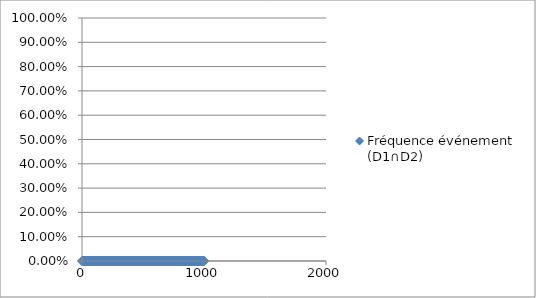
| Category | Fréquence événement (D1∩D2) |
|---|---|
| 1.0 | 0 |
| 2.0 | 0 |
| 3.0 | 0 |
| 4.0 | 0 |
| 5.0 | 0 |
| 6.0 | 0 |
| 7.0 | 0 |
| 8.0 | 0 |
| 9.0 | 0 |
| 10.0 | 0 |
| 11.0 | 0 |
| 12.0 | 0 |
| 13.0 | 0 |
| 14.0 | 0 |
| 15.0 | 0 |
| 16.0 | 0 |
| 17.0 | 0 |
| 18.0 | 0 |
| 19.0 | 0 |
| 20.0 | 0 |
| 21.0 | 0 |
| 22.0 | 0 |
| 23.0 | 0 |
| 24.0 | 0 |
| 25.0 | 0 |
| 26.0 | 0 |
| 27.0 | 0 |
| 28.0 | 0 |
| 29.0 | 0 |
| 30.0 | 0 |
| 31.0 | 0 |
| 32.0 | 0 |
| 33.0 | 0 |
| 34.0 | 0 |
| 35.0 | 0 |
| 36.0 | 0 |
| 37.0 | 0 |
| 38.0 | 0 |
| 39.0 | 0 |
| 40.0 | 0 |
| 41.0 | 0 |
| 42.0 | 0 |
| 43.0 | 0 |
| 44.0 | 0 |
| 45.0 | 0 |
| 46.0 | 0 |
| 47.0 | 0 |
| 48.0 | 0 |
| 49.0 | 0 |
| 50.0 | 0 |
| 51.0 | 0 |
| 52.0 | 0 |
| 53.0 | 0 |
| 54.0 | 0 |
| 55.0 | 0 |
| 56.0 | 0 |
| 57.0 | 0 |
| 58.0 | 0 |
| 59.0 | 0 |
| 60.0 | 0 |
| 61.0 | 0 |
| 62.0 | 0 |
| 63.0 | 0 |
| 64.0 | 0 |
| 65.0 | 0 |
| 66.0 | 0 |
| 67.0 | 0 |
| 68.0 | 0 |
| 69.0 | 0 |
| 70.0 | 0 |
| 71.0 | 0 |
| 72.0 | 0 |
| 73.0 | 0 |
| 74.0 | 0 |
| 75.0 | 0 |
| 76.0 | 0 |
| 77.0 | 0 |
| 78.0 | 0 |
| 79.0 | 0 |
| 80.0 | 0 |
| 81.0 | 0 |
| 82.0 | 0 |
| 83.0 | 0 |
| 84.0 | 0 |
| 85.0 | 0 |
| 86.0 | 0 |
| 87.0 | 0 |
| 88.0 | 0 |
| 89.0 | 0 |
| 90.0 | 0 |
| 91.0 | 0 |
| 92.0 | 0 |
| 93.0 | 0 |
| 94.0 | 0 |
| 95.0 | 0 |
| 96.0 | 0 |
| 97.0 | 0 |
| 98.0 | 0 |
| 99.0 | 0 |
| 100.0 | 0 |
| 101.0 | 0 |
| 102.0 | 0 |
| 103.0 | 0 |
| 104.0 | 0 |
| 105.0 | 0 |
| 106.0 | 0 |
| 107.0 | 0 |
| 108.0 | 0 |
| 109.0 | 0 |
| 110.0 | 0 |
| 111.0 | 0 |
| 112.0 | 0 |
| 113.0 | 0 |
| 114.0 | 0 |
| 115.0 | 0 |
| 116.0 | 0 |
| 117.0 | 0 |
| 118.0 | 0 |
| 119.0 | 0 |
| 120.0 | 0 |
| 121.0 | 0 |
| 122.0 | 0 |
| 123.0 | 0 |
| 124.0 | 0 |
| 125.0 | 0 |
| 126.0 | 0 |
| 127.0 | 0 |
| 128.0 | 0 |
| 129.0 | 0 |
| 130.0 | 0 |
| 131.0 | 0 |
| 132.0 | 0 |
| 133.0 | 0 |
| 134.0 | 0 |
| 135.0 | 0 |
| 136.0 | 0 |
| 137.0 | 0 |
| 138.0 | 0 |
| 139.0 | 0 |
| 140.0 | 0 |
| 141.0 | 0 |
| 142.0 | 0 |
| 143.0 | 0 |
| 144.0 | 0 |
| 145.0 | 0 |
| 146.0 | 0 |
| 147.0 | 0 |
| 148.0 | 0 |
| 149.0 | 0 |
| 150.0 | 0 |
| 151.0 | 0 |
| 152.0 | 0 |
| 153.0 | 0 |
| 154.0 | 0 |
| 155.0 | 0 |
| 156.0 | 0 |
| 157.0 | 0 |
| 158.0 | 0 |
| 159.0 | 0 |
| 160.0 | 0 |
| 161.0 | 0 |
| 162.0 | 0 |
| 163.0 | 0 |
| 164.0 | 0 |
| 165.0 | 0 |
| 166.0 | 0 |
| 167.0 | 0 |
| 168.0 | 0 |
| 169.0 | 0 |
| 170.0 | 0 |
| 171.0 | 0 |
| 172.0 | 0 |
| 173.0 | 0 |
| 174.0 | 0 |
| 175.0 | 0 |
| 176.0 | 0 |
| 177.0 | 0 |
| 178.0 | 0 |
| 179.0 | 0 |
| 180.0 | 0 |
| 181.0 | 0 |
| 182.0 | 0 |
| 183.0 | 0 |
| 184.0 | 0 |
| 185.0 | 0 |
| 186.0 | 0 |
| 187.0 | 0 |
| 188.0 | 0 |
| 189.0 | 0 |
| 190.0 | 0 |
| 191.0 | 0 |
| 192.0 | 0 |
| 193.0 | 0 |
| 194.0 | 0 |
| 195.0 | 0 |
| 196.0 | 0 |
| 197.0 | 0 |
| 198.0 | 0 |
| 199.0 | 0 |
| 200.0 | 0 |
| 201.0 | 0 |
| 202.0 | 0 |
| 203.0 | 0 |
| 204.0 | 0 |
| 205.0 | 0 |
| 206.0 | 0 |
| 207.0 | 0 |
| 208.0 | 0 |
| 209.0 | 0 |
| 210.0 | 0 |
| 211.0 | 0 |
| 212.0 | 0 |
| 213.0 | 0 |
| 214.0 | 0 |
| 215.0 | 0 |
| 216.0 | 0 |
| 217.0 | 0 |
| 218.0 | 0 |
| 219.0 | 0 |
| 220.0 | 0 |
| 221.0 | 0 |
| 222.0 | 0 |
| 223.0 | 0 |
| 224.0 | 0 |
| 225.0 | 0 |
| 226.0 | 0 |
| 227.0 | 0 |
| 228.0 | 0 |
| 229.0 | 0 |
| 230.0 | 0 |
| 231.0 | 0 |
| 232.0 | 0 |
| 233.0 | 0 |
| 234.0 | 0 |
| 235.0 | 0 |
| 236.0 | 0 |
| 237.0 | 0 |
| 238.0 | 0 |
| 239.0 | 0 |
| 240.0 | 0 |
| 241.0 | 0 |
| 242.0 | 0 |
| 243.0 | 0 |
| 244.0 | 0 |
| 245.0 | 0 |
| 246.0 | 0 |
| 247.0 | 0 |
| 248.0 | 0 |
| 249.0 | 0 |
| 250.0 | 0 |
| 251.0 | 0 |
| 252.0 | 0 |
| 253.0 | 0 |
| 254.0 | 0 |
| 255.0 | 0 |
| 256.0 | 0 |
| 257.0 | 0 |
| 258.0 | 0 |
| 259.0 | 0 |
| 260.0 | 0 |
| 261.0 | 0 |
| 262.0 | 0 |
| 263.0 | 0 |
| 264.0 | 0 |
| 265.0 | 0 |
| 266.0 | 0 |
| 267.0 | 0 |
| 268.0 | 0 |
| 269.0 | 0 |
| 270.0 | 0 |
| 271.0 | 0 |
| 272.0 | 0 |
| 273.0 | 0 |
| 274.0 | 0 |
| 275.0 | 0 |
| 276.0 | 0 |
| 277.0 | 0 |
| 278.0 | 0 |
| 279.0 | 0 |
| 280.0 | 0 |
| 281.0 | 0 |
| 282.0 | 0 |
| 283.0 | 0 |
| 284.0 | 0 |
| 285.0 | 0 |
| 286.0 | 0 |
| 287.0 | 0 |
| 288.0 | 0 |
| 289.0 | 0 |
| 290.0 | 0 |
| 291.0 | 0 |
| 292.0 | 0 |
| 293.0 | 0 |
| 294.0 | 0 |
| 295.0 | 0 |
| 296.0 | 0 |
| 297.0 | 0 |
| 298.0 | 0 |
| 299.0 | 0 |
| 300.0 | 0 |
| 301.0 | 0 |
| 302.0 | 0 |
| 303.0 | 0 |
| 304.0 | 0 |
| 305.0 | 0 |
| 306.0 | 0 |
| 307.0 | 0 |
| 308.0 | 0 |
| 309.0 | 0 |
| 310.0 | 0 |
| 311.0 | 0 |
| 312.0 | 0 |
| 313.0 | 0 |
| 314.0 | 0 |
| 315.0 | 0 |
| 316.0 | 0 |
| 317.0 | 0 |
| 318.0 | 0 |
| 319.0 | 0 |
| 320.0 | 0 |
| 321.0 | 0 |
| 322.0 | 0 |
| 323.0 | 0 |
| 324.0 | 0 |
| 325.0 | 0 |
| 326.0 | 0 |
| 327.0 | 0 |
| 328.0 | 0 |
| 329.0 | 0 |
| 330.0 | 0 |
| 331.0 | 0 |
| 332.0 | 0 |
| 333.0 | 0 |
| 334.0 | 0 |
| 335.0 | 0 |
| 336.0 | 0 |
| 337.0 | 0 |
| 338.0 | 0 |
| 339.0 | 0 |
| 340.0 | 0 |
| 341.0 | 0 |
| 342.0 | 0 |
| 343.0 | 0 |
| 344.0 | 0 |
| 345.0 | 0 |
| 346.0 | 0 |
| 347.0 | 0 |
| 348.0 | 0 |
| 349.0 | 0 |
| 350.0 | 0 |
| 351.0 | 0 |
| 352.0 | 0 |
| 353.0 | 0 |
| 354.0 | 0 |
| 355.0 | 0 |
| 356.0 | 0 |
| 357.0 | 0 |
| 358.0 | 0 |
| 359.0 | 0 |
| 360.0 | 0 |
| 361.0 | 0 |
| 362.0 | 0 |
| 363.0 | 0 |
| 364.0 | 0 |
| 365.0 | 0 |
| 366.0 | 0 |
| 367.0 | 0 |
| 368.0 | 0 |
| 369.0 | 0 |
| 370.0 | 0 |
| 371.0 | 0 |
| 372.0 | 0 |
| 373.0 | 0 |
| 374.0 | 0 |
| 375.0 | 0 |
| 376.0 | 0 |
| 377.0 | 0 |
| 378.0 | 0 |
| 379.0 | 0 |
| 380.0 | 0 |
| 381.0 | 0 |
| 382.0 | 0 |
| 383.0 | 0 |
| 384.0 | 0 |
| 385.0 | 0 |
| 386.0 | 0 |
| 387.0 | 0 |
| 388.0 | 0 |
| 389.0 | 0 |
| 390.0 | 0 |
| 391.0 | 0 |
| 392.0 | 0 |
| 393.0 | 0 |
| 394.0 | 0 |
| 395.0 | 0 |
| 396.0 | 0 |
| 397.0 | 0 |
| 398.0 | 0 |
| 399.0 | 0 |
| 400.0 | 0 |
| 401.0 | 0 |
| 402.0 | 0 |
| 403.0 | 0 |
| 404.0 | 0 |
| 405.0 | 0 |
| 406.0 | 0 |
| 407.0 | 0 |
| 408.0 | 0 |
| 409.0 | 0 |
| 410.0 | 0 |
| 411.0 | 0 |
| 412.0 | 0 |
| 413.0 | 0 |
| 414.0 | 0 |
| 415.0 | 0 |
| 416.0 | 0 |
| 417.0 | 0 |
| 418.0 | 0 |
| 419.0 | 0 |
| 420.0 | 0 |
| 421.0 | 0 |
| 422.0 | 0 |
| 423.0 | 0 |
| 424.0 | 0 |
| 425.0 | 0 |
| 426.0 | 0 |
| 427.0 | 0 |
| 428.0 | 0 |
| 429.0 | 0 |
| 430.0 | 0 |
| 431.0 | 0 |
| 432.0 | 0 |
| 433.0 | 0 |
| 434.0 | 0 |
| 435.0 | 0 |
| 436.0 | 0 |
| 437.0 | 0 |
| 438.0 | 0 |
| 439.0 | 0 |
| 440.0 | 0 |
| 441.0 | 0 |
| 442.0 | 0 |
| 443.0 | 0 |
| 444.0 | 0 |
| 445.0 | 0 |
| 446.0 | 0 |
| 447.0 | 0 |
| 448.0 | 0 |
| 449.0 | 0 |
| 450.0 | 0 |
| 451.0 | 0 |
| 452.0 | 0 |
| 453.0 | 0 |
| 454.0 | 0 |
| 455.0 | 0 |
| 456.0 | 0 |
| 457.0 | 0 |
| 458.0 | 0 |
| 459.0 | 0 |
| 460.0 | 0 |
| 461.0 | 0 |
| 462.0 | 0 |
| 463.0 | 0 |
| 464.0 | 0 |
| 465.0 | 0 |
| 466.0 | 0 |
| 467.0 | 0 |
| 468.0 | 0 |
| 469.0 | 0 |
| 470.0 | 0 |
| 471.0 | 0 |
| 472.0 | 0 |
| 473.0 | 0 |
| 474.0 | 0 |
| 475.0 | 0 |
| 476.0 | 0 |
| 477.0 | 0 |
| 478.0 | 0 |
| 479.0 | 0 |
| 480.0 | 0 |
| 481.0 | 0 |
| 482.0 | 0 |
| 483.0 | 0 |
| 484.0 | 0 |
| 485.0 | 0 |
| 486.0 | 0 |
| 487.0 | 0 |
| 488.0 | 0 |
| 489.0 | 0 |
| 490.0 | 0 |
| 491.0 | 0 |
| 492.0 | 0 |
| 493.0 | 0 |
| 494.0 | 0 |
| 495.0 | 0 |
| 496.0 | 0 |
| 497.0 | 0 |
| 498.0 | 0 |
| 499.0 | 0 |
| 500.0 | 0 |
| 501.0 | 0 |
| 502.0 | 0 |
| 503.0 | 0 |
| 504.0 | 0 |
| 505.0 | 0 |
| 506.0 | 0 |
| 507.0 | 0 |
| 508.0 | 0 |
| 509.0 | 0 |
| 510.0 | 0 |
| 511.0 | 0 |
| 512.0 | 0 |
| 513.0 | 0 |
| 514.0 | 0 |
| 515.0 | 0 |
| 516.0 | 0 |
| 517.0 | 0 |
| 518.0 | 0 |
| 519.0 | 0 |
| 520.0 | 0 |
| 521.0 | 0 |
| 522.0 | 0 |
| 523.0 | 0 |
| 524.0 | 0 |
| 525.0 | 0 |
| 526.0 | 0 |
| 527.0 | 0 |
| 528.0 | 0 |
| 529.0 | 0 |
| 530.0 | 0 |
| 531.0 | 0 |
| 532.0 | 0 |
| 533.0 | 0 |
| 534.0 | 0 |
| 535.0 | 0 |
| 536.0 | 0 |
| 537.0 | 0 |
| 538.0 | 0 |
| 539.0 | 0 |
| 540.0 | 0 |
| 541.0 | 0 |
| 542.0 | 0 |
| 543.0 | 0 |
| 544.0 | 0 |
| 545.0 | 0 |
| 546.0 | 0 |
| 547.0 | 0 |
| 548.0 | 0 |
| 549.0 | 0 |
| 550.0 | 0 |
| 551.0 | 0 |
| 552.0 | 0 |
| 553.0 | 0 |
| 554.0 | 0 |
| 555.0 | 0 |
| 556.0 | 0 |
| 557.0 | 0 |
| 558.0 | 0 |
| 559.0 | 0 |
| 560.0 | 0 |
| 561.0 | 0 |
| 562.0 | 0 |
| 563.0 | 0 |
| 564.0 | 0 |
| 565.0 | 0 |
| 566.0 | 0 |
| 567.0 | 0 |
| 568.0 | 0 |
| 569.0 | 0 |
| 570.0 | 0 |
| 571.0 | 0 |
| 572.0 | 0 |
| 573.0 | 0 |
| 574.0 | 0 |
| 575.0 | 0 |
| 576.0 | 0 |
| 577.0 | 0 |
| 578.0 | 0 |
| 579.0 | 0 |
| 580.0 | 0 |
| 581.0 | 0 |
| 582.0 | 0 |
| 583.0 | 0 |
| 584.0 | 0 |
| 585.0 | 0 |
| 586.0 | 0 |
| 587.0 | 0 |
| 588.0 | 0 |
| 589.0 | 0 |
| 590.0 | 0 |
| 591.0 | 0 |
| 592.0 | 0 |
| 593.0 | 0 |
| 594.0 | 0 |
| 595.0 | 0 |
| 596.0 | 0 |
| 597.0 | 0 |
| 598.0 | 0 |
| 599.0 | 0 |
| 600.0 | 0 |
| 601.0 | 0 |
| 602.0 | 0 |
| 603.0 | 0 |
| 604.0 | 0 |
| 605.0 | 0 |
| 606.0 | 0 |
| 607.0 | 0 |
| 608.0 | 0 |
| 609.0 | 0 |
| 610.0 | 0 |
| 611.0 | 0 |
| 612.0 | 0 |
| 613.0 | 0 |
| 614.0 | 0 |
| 615.0 | 0 |
| 616.0 | 0 |
| 617.0 | 0 |
| 618.0 | 0 |
| 619.0 | 0 |
| 620.0 | 0 |
| 621.0 | 0 |
| 622.0 | 0 |
| 623.0 | 0 |
| 624.0 | 0 |
| 625.0 | 0 |
| 626.0 | 0 |
| 627.0 | 0 |
| 628.0 | 0 |
| 629.0 | 0 |
| 630.0 | 0 |
| 631.0 | 0 |
| 632.0 | 0 |
| 633.0 | 0 |
| 634.0 | 0 |
| 635.0 | 0 |
| 636.0 | 0 |
| 637.0 | 0 |
| 638.0 | 0 |
| 639.0 | 0 |
| 640.0 | 0 |
| 641.0 | 0 |
| 642.0 | 0 |
| 643.0 | 0 |
| 644.0 | 0 |
| 645.0 | 0 |
| 646.0 | 0 |
| 647.0 | 0 |
| 648.0 | 0 |
| 649.0 | 0 |
| 650.0 | 0 |
| 651.0 | 0 |
| 652.0 | 0 |
| 653.0 | 0 |
| 654.0 | 0 |
| 655.0 | 0 |
| 656.0 | 0 |
| 657.0 | 0 |
| 658.0 | 0 |
| 659.0 | 0 |
| 660.0 | 0 |
| 661.0 | 0 |
| 662.0 | 0 |
| 663.0 | 0 |
| 664.0 | 0 |
| 665.0 | 0 |
| 666.0 | 0 |
| 667.0 | 0 |
| 668.0 | 0 |
| 669.0 | 0 |
| 670.0 | 0 |
| 671.0 | 0 |
| 672.0 | 0 |
| 673.0 | 0 |
| 674.0 | 0 |
| 675.0 | 0 |
| 676.0 | 0 |
| 677.0 | 0 |
| 678.0 | 0 |
| 679.0 | 0 |
| 680.0 | 0 |
| 681.0 | 0 |
| 682.0 | 0 |
| 683.0 | 0 |
| 684.0 | 0 |
| 685.0 | 0 |
| 686.0 | 0 |
| 687.0 | 0 |
| 688.0 | 0 |
| 689.0 | 0 |
| 690.0 | 0 |
| 691.0 | 0 |
| 692.0 | 0 |
| 693.0 | 0 |
| 694.0 | 0 |
| 695.0 | 0 |
| 696.0 | 0 |
| 697.0 | 0 |
| 698.0 | 0 |
| 699.0 | 0 |
| 700.0 | 0 |
| 701.0 | 0 |
| 702.0 | 0 |
| 703.0 | 0 |
| 704.0 | 0 |
| 705.0 | 0 |
| 706.0 | 0 |
| 707.0 | 0 |
| 708.0 | 0 |
| 709.0 | 0 |
| 710.0 | 0 |
| 711.0 | 0 |
| 712.0 | 0 |
| 713.0 | 0 |
| 714.0 | 0 |
| 715.0 | 0 |
| 716.0 | 0 |
| 717.0 | 0 |
| 718.0 | 0 |
| 719.0 | 0 |
| 720.0 | 0 |
| 721.0 | 0 |
| 722.0 | 0 |
| 723.0 | 0 |
| 724.0 | 0 |
| 725.0 | 0 |
| 726.0 | 0 |
| 727.0 | 0 |
| 728.0 | 0 |
| 729.0 | 0 |
| 730.0 | 0 |
| 731.0 | 0 |
| 732.0 | 0 |
| 733.0 | 0 |
| 734.0 | 0 |
| 735.0 | 0 |
| 736.0 | 0 |
| 737.0 | 0 |
| 738.0 | 0 |
| 739.0 | 0 |
| 740.0 | 0 |
| 741.0 | 0 |
| 742.0 | 0 |
| 743.0 | 0 |
| 744.0 | 0 |
| 745.0 | 0 |
| 746.0 | 0 |
| 747.0 | 0 |
| 748.0 | 0 |
| 749.0 | 0 |
| 750.0 | 0 |
| 751.0 | 0 |
| 752.0 | 0 |
| 753.0 | 0 |
| 754.0 | 0 |
| 755.0 | 0 |
| 756.0 | 0 |
| 757.0 | 0 |
| 758.0 | 0 |
| 759.0 | 0 |
| 760.0 | 0 |
| 761.0 | 0 |
| 762.0 | 0 |
| 763.0 | 0 |
| 764.0 | 0 |
| 765.0 | 0 |
| 766.0 | 0 |
| 767.0 | 0 |
| 768.0 | 0 |
| 769.0 | 0 |
| 770.0 | 0 |
| 771.0 | 0 |
| 772.0 | 0 |
| 773.0 | 0 |
| 774.0 | 0 |
| 775.0 | 0 |
| 776.0 | 0 |
| 777.0 | 0 |
| 778.0 | 0 |
| 779.0 | 0 |
| 780.0 | 0 |
| 781.0 | 0 |
| 782.0 | 0 |
| 783.0 | 0 |
| 784.0 | 0 |
| 785.0 | 0 |
| 786.0 | 0 |
| 787.0 | 0 |
| 788.0 | 0 |
| 789.0 | 0 |
| 790.0 | 0 |
| 791.0 | 0 |
| 792.0 | 0 |
| 793.0 | 0 |
| 794.0 | 0 |
| 795.0 | 0 |
| 796.0 | 0 |
| 797.0 | 0 |
| 798.0 | 0 |
| 799.0 | 0 |
| 800.0 | 0 |
| 801.0 | 0 |
| 802.0 | 0 |
| 803.0 | 0 |
| 804.0 | 0 |
| 805.0 | 0 |
| 806.0 | 0 |
| 807.0 | 0 |
| 808.0 | 0 |
| 809.0 | 0 |
| 810.0 | 0 |
| 811.0 | 0 |
| 812.0 | 0 |
| 813.0 | 0 |
| 814.0 | 0 |
| 815.0 | 0 |
| 816.0 | 0 |
| 817.0 | 0 |
| 818.0 | 0 |
| 819.0 | 0 |
| 820.0 | 0 |
| 821.0 | 0 |
| 822.0 | 0 |
| 823.0 | 0 |
| 824.0 | 0 |
| 825.0 | 0 |
| 826.0 | 0 |
| 827.0 | 0 |
| 828.0 | 0 |
| 829.0 | 0 |
| 830.0 | 0 |
| 831.0 | 0 |
| 832.0 | 0 |
| 833.0 | 0 |
| 834.0 | 0 |
| 835.0 | 0 |
| 836.0 | 0 |
| 837.0 | 0 |
| 838.0 | 0 |
| 839.0 | 0 |
| 840.0 | 0 |
| 841.0 | 0 |
| 842.0 | 0 |
| 843.0 | 0 |
| 844.0 | 0 |
| 845.0 | 0 |
| 846.0 | 0 |
| 847.0 | 0 |
| 848.0 | 0 |
| 849.0 | 0 |
| 850.0 | 0 |
| 851.0 | 0 |
| 852.0 | 0 |
| 853.0 | 0 |
| 854.0 | 0 |
| 855.0 | 0 |
| 856.0 | 0 |
| 857.0 | 0 |
| 858.0 | 0 |
| 859.0 | 0 |
| 860.0 | 0 |
| 861.0 | 0 |
| 862.0 | 0 |
| 863.0 | 0 |
| 864.0 | 0 |
| 865.0 | 0 |
| 866.0 | 0 |
| 867.0 | 0 |
| 868.0 | 0 |
| 869.0 | 0 |
| 870.0 | 0 |
| 871.0 | 0 |
| 872.0 | 0 |
| 873.0 | 0 |
| 874.0 | 0 |
| 875.0 | 0 |
| 876.0 | 0 |
| 877.0 | 0 |
| 878.0 | 0 |
| 879.0 | 0 |
| 880.0 | 0 |
| 881.0 | 0 |
| 882.0 | 0 |
| 883.0 | 0 |
| 884.0 | 0 |
| 885.0 | 0 |
| 886.0 | 0 |
| 887.0 | 0 |
| 888.0 | 0 |
| 889.0 | 0 |
| 890.0 | 0 |
| 891.0 | 0 |
| 892.0 | 0 |
| 893.0 | 0 |
| 894.0 | 0 |
| 895.0 | 0 |
| 896.0 | 0 |
| 897.0 | 0 |
| 898.0 | 0 |
| 899.0 | 0 |
| 900.0 | 0 |
| 901.0 | 0 |
| 902.0 | 0 |
| 903.0 | 0 |
| 904.0 | 0 |
| 905.0 | 0 |
| 906.0 | 0 |
| 907.0 | 0 |
| 908.0 | 0 |
| 909.0 | 0 |
| 910.0 | 0 |
| 911.0 | 0 |
| 912.0 | 0 |
| 913.0 | 0 |
| 914.0 | 0 |
| 915.0 | 0 |
| 916.0 | 0 |
| 917.0 | 0 |
| 918.0 | 0 |
| 919.0 | 0 |
| 920.0 | 0 |
| 921.0 | 0 |
| 922.0 | 0 |
| 923.0 | 0 |
| 924.0 | 0 |
| 925.0 | 0 |
| 926.0 | 0 |
| 927.0 | 0 |
| 928.0 | 0 |
| 929.0 | 0 |
| 930.0 | 0 |
| 931.0 | 0 |
| 932.0 | 0 |
| 933.0 | 0 |
| 934.0 | 0 |
| 935.0 | 0 |
| 936.0 | 0 |
| 937.0 | 0 |
| 938.0 | 0 |
| 939.0 | 0 |
| 940.0 | 0 |
| 941.0 | 0 |
| 942.0 | 0 |
| 943.0 | 0 |
| 944.0 | 0 |
| 945.0 | 0 |
| 946.0 | 0 |
| 947.0 | 0 |
| 948.0 | 0 |
| 949.0 | 0 |
| 950.0 | 0 |
| 951.0 | 0 |
| 952.0 | 0 |
| 953.0 | 0 |
| 954.0 | 0 |
| 955.0 | 0 |
| 956.0 | 0 |
| 957.0 | 0 |
| 958.0 | 0 |
| 959.0 | 0 |
| 960.0 | 0 |
| 961.0 | 0 |
| 962.0 | 0 |
| 963.0 | 0 |
| 964.0 | 0 |
| 965.0 | 0 |
| 966.0 | 0 |
| 967.0 | 0 |
| 968.0 | 0 |
| 969.0 | 0 |
| 970.0 | 0 |
| 971.0 | 0 |
| 972.0 | 0 |
| 973.0 | 0 |
| 974.0 | 0 |
| 975.0 | 0 |
| 976.0 | 0 |
| 977.0 | 0 |
| 978.0 | 0 |
| 979.0 | 0 |
| 980.0 | 0 |
| 981.0 | 0 |
| 982.0 | 0 |
| 983.0 | 0 |
| 984.0 | 0 |
| 985.0 | 0 |
| 986.0 | 0 |
| 987.0 | 0 |
| 988.0 | 0 |
| 989.0 | 0 |
| 990.0 | 0 |
| 991.0 | 0 |
| 992.0 | 0 |
| 993.0 | 0 |
| 994.0 | 0 |
| 995.0 | 0 |
| 996.0 | 0 |
| 997.0 | 0 |
| 998.0 | 0 |
| 999.0 | 0 |
| 1000.0 | 0 |